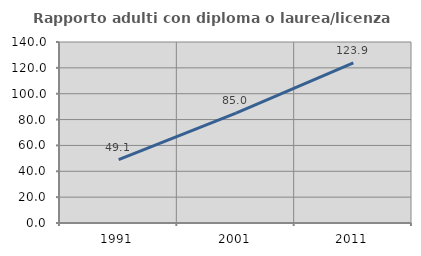
| Category | Rapporto adulti con diploma o laurea/licenza media  |
|---|---|
| 1991.0 | 49.095 |
| 2001.0 | 85.037 |
| 2011.0 | 123.859 |